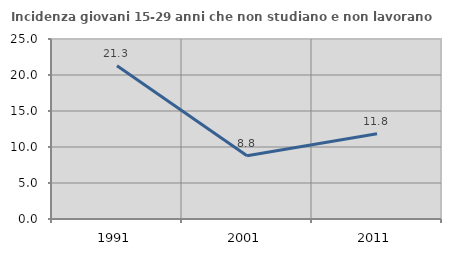
| Category | Incidenza giovani 15-29 anni che non studiano e non lavorano  |
|---|---|
| 1991.0 | 21.296 |
| 2001.0 | 8.795 |
| 2011.0 | 11.838 |